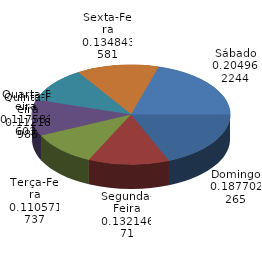
| Category | Qtde Acidentes |
|---|---|
| Domingo | 348 |
| Segunda-Feira | 245 |
| Terça-Feira | 205 |
| Quarta-Feira | 218 |
| Quinta-Feira | 208 |
| Sexta-Feira | 250 |
| Sábado | 380 |